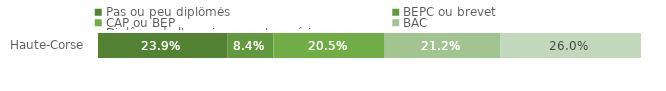
| Category | Pas ou peu diplômés | BEPC ou brevet | CAP ou BEP | BAC | Diplôme de l'enseignement supérieur |
|---|---|---|---|---|---|
| Haute-Corse | 0.239 | 0.084 | 0.205 | 0.212 | 0.26 |